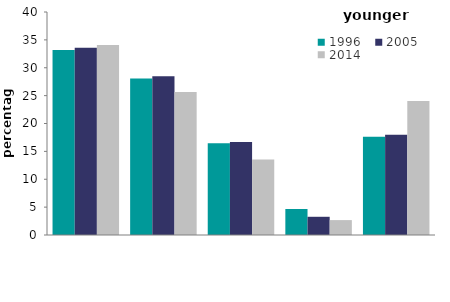
| Category | 1996 | 2005 | 2014 |
|---|---|---|---|
| terraced 
house | 33.2 | 33.597 | 34.095 |
| semi-detached 
house | 28.067 | 28.493 | 25.644 |
| detached 
house | 16.457 | 16.68 | 13.531 |
| bungalow | 4.666 | 3.267 | 2.672 |
| flat | 17.611 | 17.964 | 24.058 |